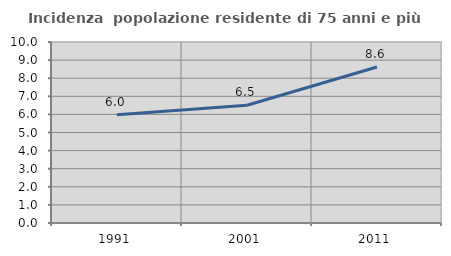
| Category | Incidenza  popolazione residente di 75 anni e più |
|---|---|
| 1991.0 | 5.98 |
| 2001.0 | 6.506 |
| 2011.0 | 8.615 |